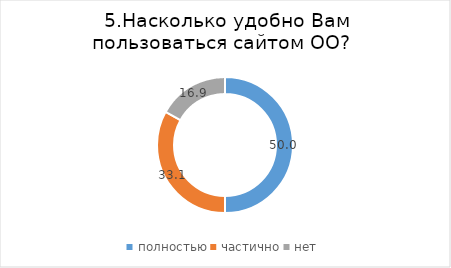
| Category | Series 0 |
|---|---|
| полностью | 50 |
| частично | 33.099 |
| нет | 16.901 |